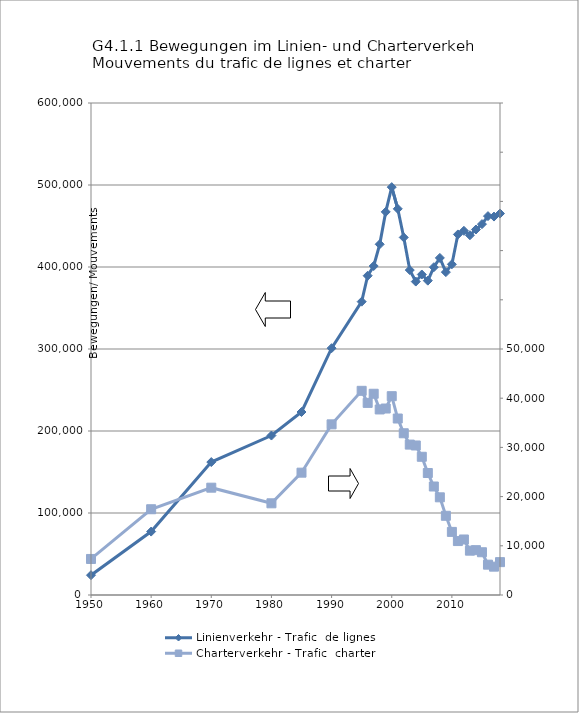
| Category | Linienverkehr - Trafic  de lignes |
|---|---|
| 1950.0 | 24166 |
| 1960.0 | 77337 |
| 1970.0 | 162118 |
| 1980.0 | 194463 |
| 1985.0 | 223154 |
| 1990.0 | 301006 |
| 1995.0 | 357731 |
| 1996.0 | 389383 |
| 1997.0 | 401195 |
| 1998.0 | 427694 |
| 1999.0 | 467220 |
| 2000.0 | 497403 |
| 2001.0 | 470947 |
| 2002.0 | 436018 |
| 2003.0 | 396268 |
| 2004.0 | 382229 |
| 2005.0 | 390862 |
| 2006.0 | 383343 |
| 2007.0 | 399730 |
| 2008.0 | 411090 |
| 2009.0 | 393747 |
| 2010.0 | 403286 |
| 2011.0 | 439725 |
| 2012.0 | 444138 |
| 2013.0 | 438725 |
| 2014.0 | 445723 |
| 2015.0 | 452286 |
| 2016.0 | 462059 |
| 2017.0 | 461501 |
| 2018.0 | 465191 |